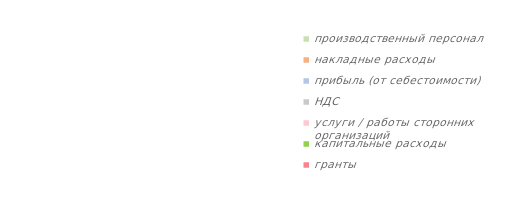
| Category | Series 0 |
|---|---|
| производственный персонал | 0 |
| накладные расходы | 0 |
| прибыль (от себестоимости) | 0 |
| НДС | 0 |
| услуги / работы сторонних организаций | 0 |
| капитальные расходы | 0 |
| гранты | 0 |